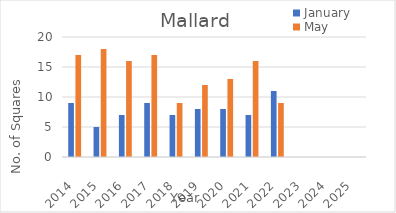
| Category | January | May |
|---|---|---|
| 2014.0 | 9 | 17 |
| 2015.0 | 5 | 18 |
| 2016.0 | 7 | 16 |
| 2017.0 | 9 | 17 |
| 2018.0 | 7 | 9 |
| 2019.0 | 8 | 12 |
| 2020.0 | 8 | 13 |
| 2021.0 | 7 | 16 |
| 2022.0 | 11 | 9 |
| 2023.0 | 0 | 0 |
| 2024.0 | 0 | 0 |
| 2025.0 | 0 | 0 |